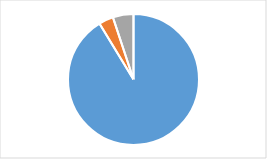
| Category | Series 0 |
|---|---|
| 0 | 0.913 |
| 1 | 0.036 |
| 2 | 0.051 |